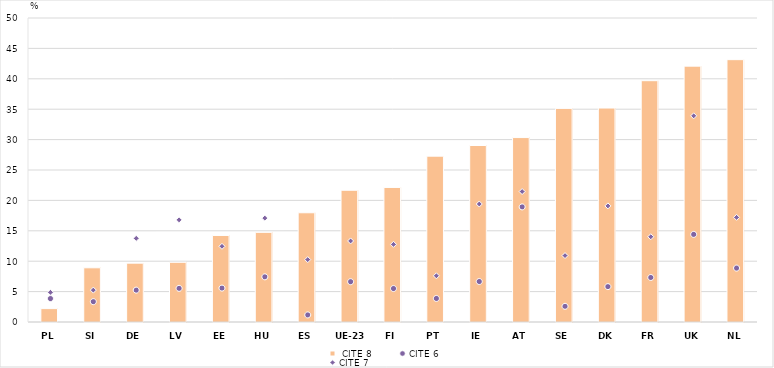
| Category |  CITE 8 |
|---|---|
| 0 | 2.202 |
| 1 | 8.913 |
| 2 | 9.682 |
| 3 | 9.821 |
| 4 | 14.231 |
| 5 | 14.746 |
| 6 | 17.966 |
| 7 | 21.665 |
| 8 | 22.13 |
| 9 | 27.277 |
| 10 | 29.027 |
| 11 | 30.335 |
| 12 | 35.131 |
| 13 | 35.191 |
| 14 | 39.689 |
| 15 | 42.082 |
| 16 | 43.148 |